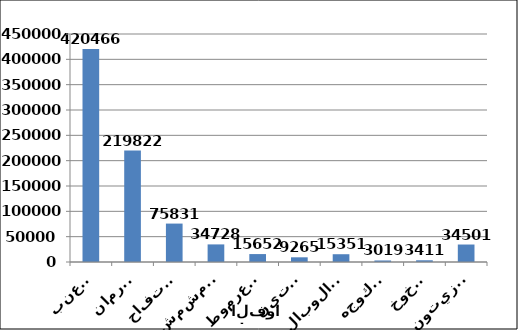
| Category | 2019 |
|---|---|
| العنب | 420466 |
| الرمان | 219822 |
| التفاح | 75831 |
| المشمش | 34728 |
| العرموط | 15652 |
| التين | 9265 |
| الالوبالو | 15351 |
| الكوجه | 3019 |
| الخوخ | 3411 |
| الزيتون | 34501 |